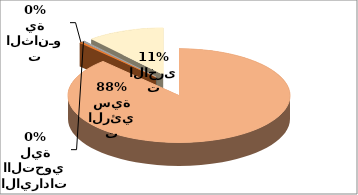
| Category | Series 0 |
|---|---|
| الايرادات الرئيسية | 5929730230 |
| الايـرادات الثانـوية | 28623201 |
| الايرادات االتحويلية | 25165579 |
| الايرادات الاخرى | 754935048 |